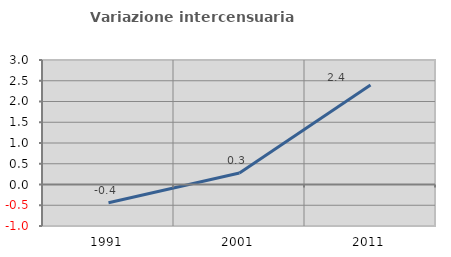
| Category | Variazione intercensuaria annua |
|---|---|
| 1991.0 | -0.441 |
| 2001.0 | 0.276 |
| 2011.0 | 2.399 |